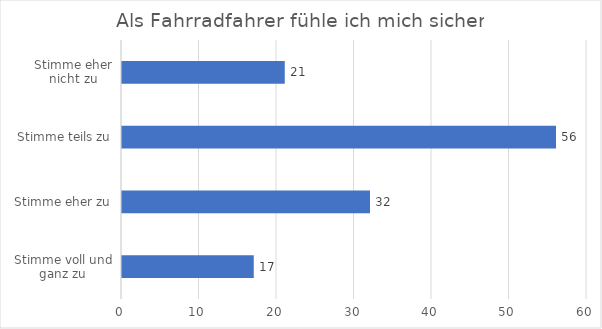
| Category | Series 0 |
|---|---|
| Stimme voll und ganz zu | 17 |
| Stimme eher zu | 32 |
| Stimme teils zu | 56 |
| Stimme eher nicht zu | 21 |